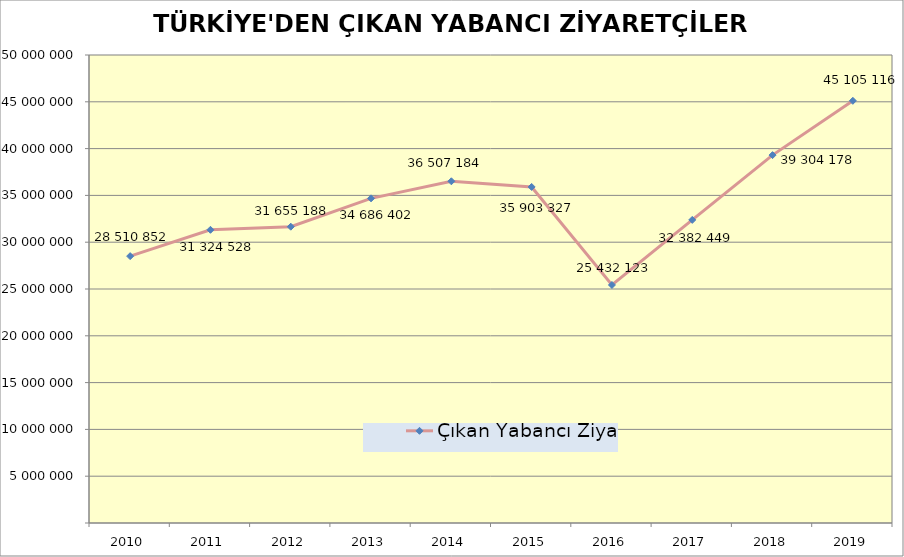
| Category | Çıkan Yabancı Ziyaretçi |
|---|---|
| 2010.0 | 28510852 |
| 2011.0 | 31324528 |
| 2012.0 | 31655188 |
| 2013.0 | 34686402 |
| 2014.0 | 36507184 |
| 2015.0 | 35903327 |
| 2016.0 | 25432123 |
| 2017.0 | 32382449 |
| 2018.0 | 39304178 |
| 2019.0 | 45105116 |